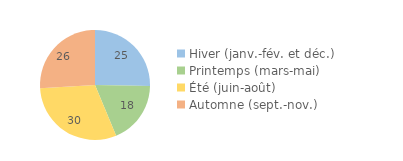
| Category | Series 0 |
|---|---|
| Hiver (janv.-fév. et déc.) | 25.26 |
| Printemps (mars-mai) | 18.46 |
| Été (juin-août) | 30.36 |
| Automne (sept.-nov.) | 25.93 |